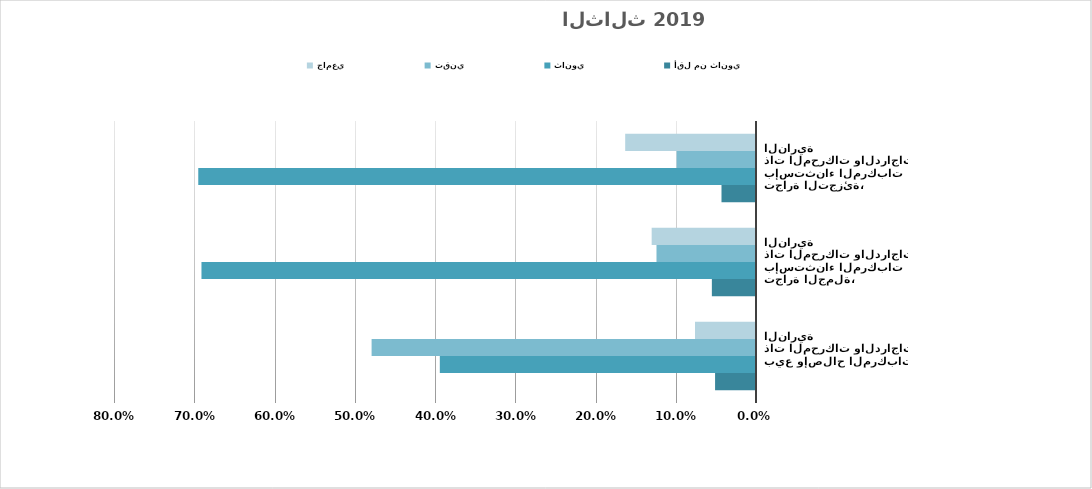
| Category | أقل من ثانوي | ثانوي | تقني | جامعي |
|---|---|---|---|---|
| بيع وإصلاح المركبات ذات المحركات والدراجات النارية | 0.051 | 0.394 | 0.479 | 0.076 |
| تجارة الجملة، بإستثناء المركبات ذات المحركات والدراجات النارية | 0.055 | 0.691 | 0.124 | 0.13 |
| تجارة التجزئة، بإستثناء المركبات ذات المحركات والدراجات النارية | 0.043 | 0.695 | 0.099 | 0.163 |